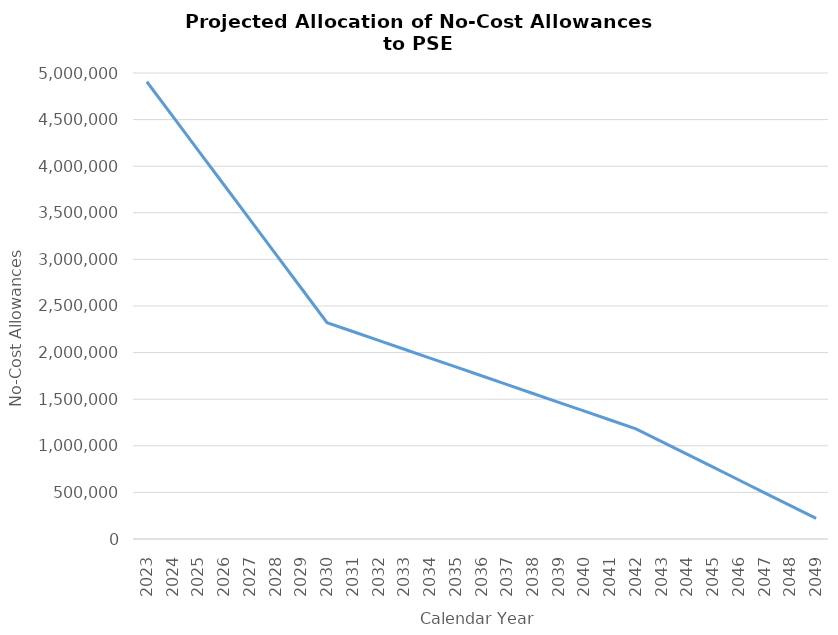
| Category | Series 0 |
|---|---|
| 2023.0 | 4906163 |
| 2024.0 | 4536882 |
| 2025.0 | 4167601 |
| 2026.0 | 3798320 |
| 2027.0 | 3429039 |
| 2028.0 | 3059758 |
| 2029.0 | 2690477 |
| 2030.0 | 2321196 |
| 2031.0 | 2226238 |
| 2032.0 | 2131280 |
| 2033.0 | 2036322 |
| 2034.0 | 1941364 |
| 2035.0 | 1846406 |
| 2036.0 | 1751448 |
| 2037.0 | 1656490 |
| 2038.0 | 1561532 |
| 2039.0 | 1466574 |
| 2040.0 | 1371616 |
| 2041.0 | 1276658 |
| 2042.0 | 1181700 |
| 2043.0 | 1044538 |
| 2044.0 | 907376 |
| 2045.0 | 770214 |
| 2046.0 | 633052 |
| 2047.0 | 495890 |
| 2048.0 | 358728 |
| 2049.0 | 221566 |